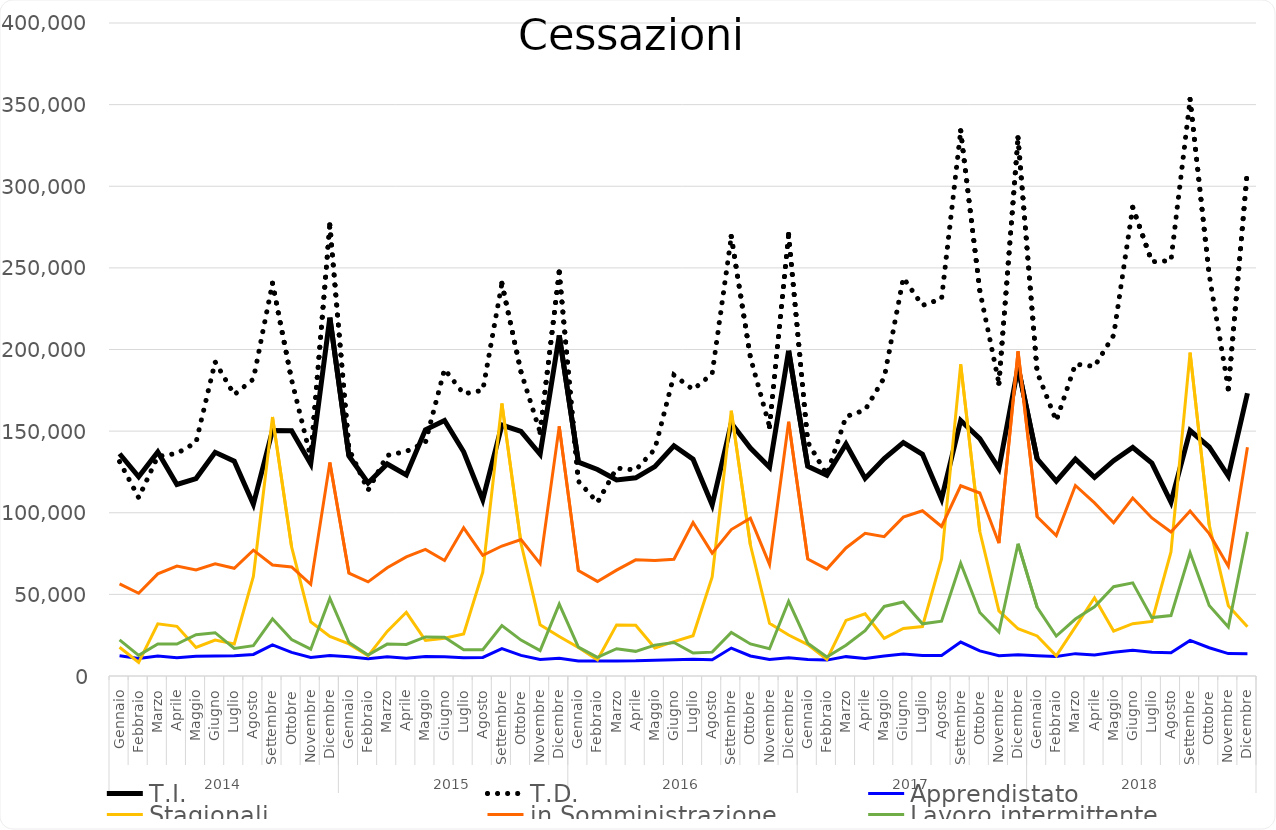
| Category | T.I. | T.D. | Apprendistato | Stagionali | in Somministrazione | Lavoro intermittente |
|---|---|---|---|---|---|---|
| 0 | 136150 | 131342 | 12417 | 17625 | 56394 | 22091 |
| 1 | 121982 | 109240 | 10766 | 8271 | 50700 | 12655 |
| 2 | 137177 | 134529 | 12288 | 31941 | 62552 | 19592 |
| 3 | 117316 | 136349 | 11118 | 30408 | 67376 | 19607 |
| 4 | 120941 | 143066 | 12092 | 17482 | 64946 | 25310 |
| 5 | 136995 | 192426 | 12268 | 22017 | 68720 | 26528 |
| 6 | 131572 | 172323 | 12337 | 19663 | 65995 | 16862 |
| 7 | 105193 | 181862 | 13223 | 61051 | 77075 | 18605 |
| 8 | 150436 | 240590 | 19086 | 158671 | 68004 | 35016 |
| 9 | 150292 | 181440 | 14495 | 79045 | 66820 | 22313 |
| 10 | 129926 | 133845 | 11383 | 33189 | 56121 | 16419 |
| 11 | 219564 | 276344 | 12627 | 24287 | 130844 | 47663 |
| 12 | 134760 | 139066 | 11769 | 19690 | 62987 | 20472 |
| 13 | 118245 | 113817 | 10611 | 12343 | 57652 | 12821 |
| 14 | 129887 | 135107 | 11768 | 27293 | 66344 | 19553 |
| 15 | 123205 | 137576 | 10944 | 39020 | 72982 | 19313 |
| 16 | 150818 | 143063 | 12003 | 21801 | 77593 | 23934 |
| 17 | 156557 | 187931 | 11841 | 23170 | 70789 | 23810 |
| 18 | 137335 | 172852 | 11248 | 25758 | 90771 | 16110 |
| 19 | 107985 | 175006 | 11384 | 63641 | 73927 | 16130 |
| 20 | 153717 | 240531 | 16799 | 166943 | 79619 | 30874 |
| 21 | 149774 | 186266 | 12640 | 81323 | 83637 | 21996 |
| 22 | 135838 | 149287 | 10118 | 31306 | 68827 | 15570 |
| 23 | 208699 | 247508 | 10868 | 24240 | 152934 | 44004 |
| 24 | 130993 | 119339 | 9240 | 17478 | 64533 | 17661 |
| 25 | 126502 | 106299 | 9249 | 9924 | 57929 | 11446 |
| 26 | 120053 | 127336 | 9179 | 31307 | 64877 | 16719 |
| 27 | 121388 | 126202 | 9296 | 31098 | 71155 | 15093 |
| 28 | 128274 | 138922 | 9676 | 17129 | 70755 | 18927 |
| 29 | 140997 | 184334 | 9992 | 21053 | 71515 | 20500 |
| 30 | 132788 | 175425 | 10197 | 24678 | 94054 | 14061 |
| 31 | 104742 | 185130 | 9989 | 60727 | 75262 | 14619 |
| 32 | 154878 | 269228 | 17110 | 162504 | 89698 | 26686 |
| 33 | 139594 | 195148 | 12285 | 80236 | 96625 | 19629 |
| 34 | 127852 | 152784 | 10073 | 32243 | 68345 | 16648 |
| 35 | 199217 | 270495 | 11228 | 25122 | 155713 | 45775 |
| 36 | 128463 | 143265 | 10136 | 19236 | 71660 | 20127 |
| 37 | 122984 | 123244 | 9736 | 10195 | 65503 | 11660 |
| 38 | 142125 | 158891 | 11862 | 34042 | 78439 | 18823 |
| 39 | 121034 | 162967 | 10753 | 38064 | 87441 | 27823 |
| 40 | 133148 | 182738 | 12310 | 23026 | 85351 | 42600 |
| 41 | 142944 | 243943 | 13506 | 29091 | 97315 | 45367 |
| 42 | 135823 | 227015 | 12530 | 30302 | 101225 | 31965 |
| 43 | 108507 | 231080 | 12508 | 71770 | 91572 | 33569 |
| 44 | 156511 | 333992 | 20798 | 190840 | 116534 | 69143 |
| 45 | 145393 | 236006 | 15365 | 88500 | 112110 | 38926 |
| 46 | 126989 | 179349 | 12424 | 39848 | 81344 | 26987 |
| 47 | 189144 | 329695 | 13013 | 28951 | 198908 | 80998 |
| 48 | 133024 | 186068 | 12451 | 24539 | 97497 | 42007 |
| 49 | 119330 | 156294 | 11932 | 12332 | 86049 | 24447 |
| 50 | 132808 | 191036 | 13697 | 30085 | 116685 | 34879 |
| 51 | 121662 | 189619 | 12885 | 47935 | 106022 | 42375 |
| 52 | 131917 | 208701 | 14486 | 27532 | 93857 | 54672 |
| 53 | 139974 | 287071 | 15704 | 32054 | 108984 | 57060 |
| 54 | 130439 | 253760 | 14523 | 33385 | 96798 | 35765 |
| 55 | 106431 | 254415 | 14184 | 76022 | 88224 | 36991 |
| 56 | 150347 | 353205 | 21822 | 198100 | 101019 | 75509 |
| 57 | 140277 | 245674 | 17300 | 92515 | 87198 | 43145 |
| 58 | 122468 | 175886 | 13713 | 43052 | 67286 | 30045 |
| 59 | 173203 | 310419 | 13673 | 30108 | 140168 | 88308 |